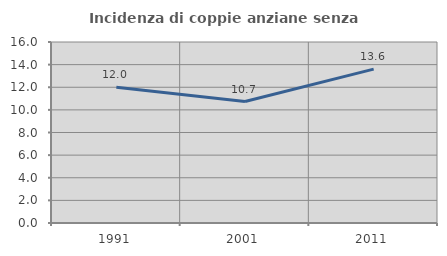
| Category | Incidenza di coppie anziane senza figli  |
|---|---|
| 1991.0 | 11.991 |
| 2001.0 | 10.736 |
| 2011.0 | 13.6 |